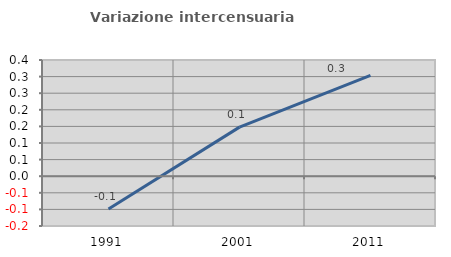
| Category | Variazione intercensuaria annua |
|---|---|
| 1991.0 | -0.099 |
| 2001.0 | 0.148 |
| 2011.0 | 0.304 |